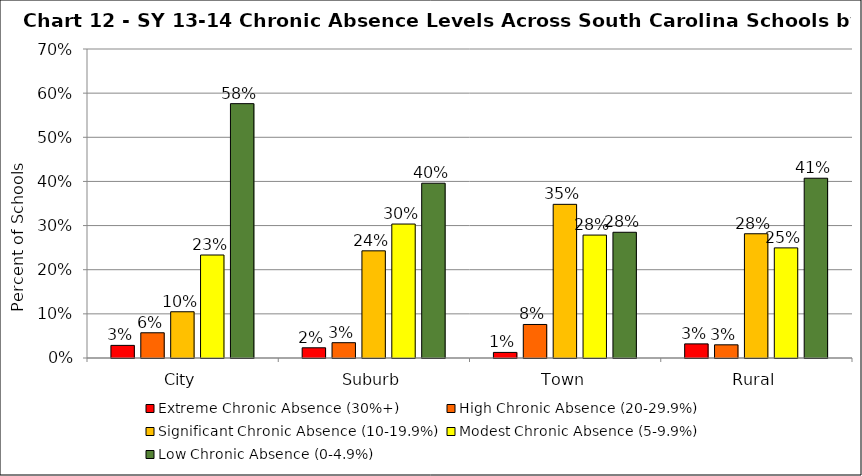
| Category | Extreme Chronic Absence (30%+) | High Chronic Absence (20-29.9%) | Significant Chronic Absence (10-19.9%) | Modest Chronic Absence (5-9.9%) | Low Chronic Absence (0-4.9%) |
|---|---|---|---|---|---|
| 0 | 0.029 | 0.057 | 0.105 | 0.233 | 0.576 |
| 1 | 0.023 | 0.035 | 0.243 | 0.303 | 0.396 |
| 2 | 0.013 | 0.076 | 0.348 | 0.278 | 0.285 |
| 3 | 0.032 | 0.03 | 0.281 | 0.249 | 0.407 |